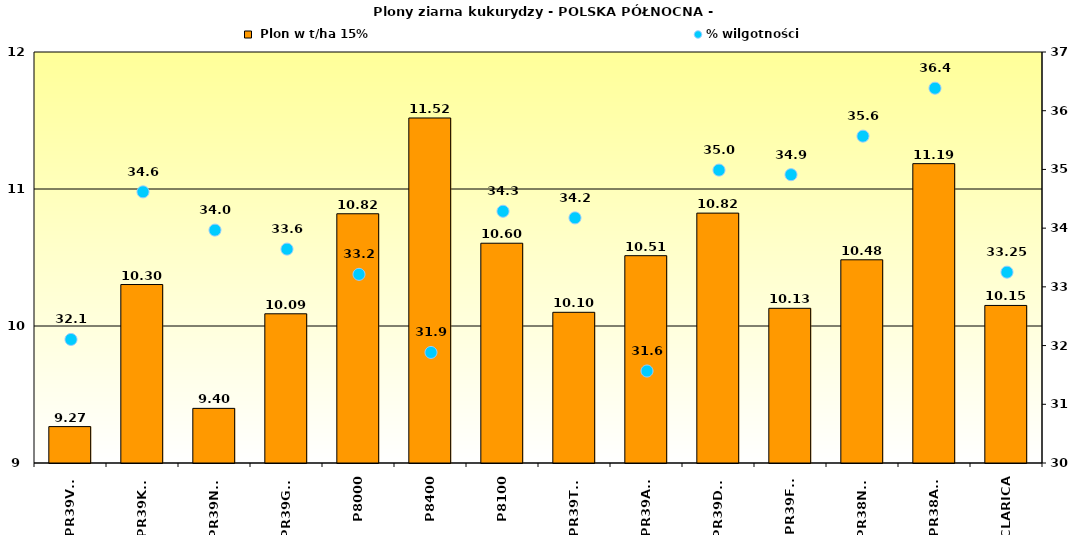
| Category |  Plon w t/ha 15% |
|---|---|
| PR39V43 | 9.266 |
| PR39K13 | 10.303 |
| PR39N39 | 9.399 |
| PR39G12 | 10.089 |
| P8000 | 10.819 |
| P8400 | 11.518 |
| P8100 | 10.604 |
| PR39T13 | 10.1 |
| PR39A98 | 10.513 |
| PR39D23 | 10.824 |
| PR39F58 | 10.129 |
| PR38N86 | 10.483 |
| PR38A79 | 11.185 |
| CLARICA | 10.15 |